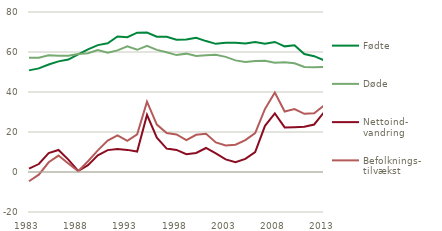
| Category | Fødte | Døde | Nettoind-
vandring | Befolknings- tilvækst |
|---|---|---|---|---|
| 1983 | 50.822 | 57.156 | 1.719 | -4.615 |
| 1984 | 51.8 | 57.109 | 3.982 | -1.327 |
| 1985 | 53.749 | 58.378 | 9.499 | 4.87 |
| 1986 | 55.312 | 58.1 | 11.004 | 8.216 |
| 1987 | 56.221 | 58.136 | 6.173 | 4.258 |
| 1988 | 58.844 | 58.984 | 0.507 | 0.367 |
| 1989 | 61.351 | 59.397 | 3.442 | 5.396 |
| 1990 | 63.433 | 60.926 | 8.332 | 10.839 |
| 1991 | 64.358 | 59.581 | 10.938 | 15.715 |
| 1992 | 67.726 | 60.821 | 11.462 | 18.367 |
| 1993 | 67.369 | 62.809 | 11.056 | 15.616 |
| 1994 | 69.666 | 61.099 | 10.251 | 18.818 |
| 1995 | 69.771 | 63.127 | 28.557 | 35.201 |
| 1996 | 67.638 | 61.043 | 17.133 | 23.728 |
| 1997 | 67.648 | 59.898 | 11.712 | 19.462 |
| 1998 | 66.174 | 58.453 | 11.032 | 18.753 |
| 1999 | 66.22 | 59.179 | 8.896 | 15.937 |
| 2000 | 67.084 | 57.998 | 9.498 | 18.584 |
| 2001 | 65.458 | 58.355 | 12.004 | 19.107 |
| 2002 | 64.075 | 58.61 | 9.297 | 14.762 |
| 2003 | 64.599 | 57.574 | 6.288 | 13.313 |
| 2004 | 64.609 | 55.806 | 4.843 | 13.646 |
| 2005 | 64.282 | 54.962 | 6.589 | 15.909 |
| 2006 | 64.984 | 55.477 | 9.964 | 19.471 |
| 2007 | 64.082 | 55.604 | 23.09 | 31.568 |
| 2008 | 65.038 | 54.591 | 29.259 | 39.706 |
| 2009 | 62.818 | 54.872 | 22.287 | 30.233 |
| 2010 | 63.411 | 54.368 | 22.4 | 31.443 |
| 2011 | 58.998 | 52.516 | 22.614 | 29.096 |
| 2012 | 57.916 | 52.325 | 23.751 | 29.342 |
| 2013 | 55.873 | 52.471 | 29.865 | 33.267 |